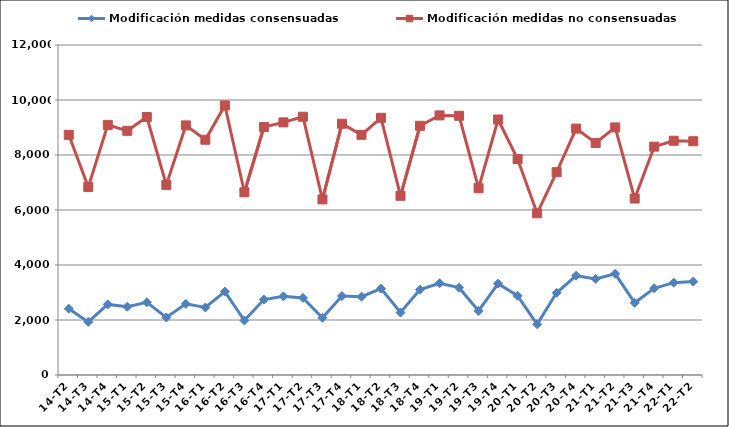
| Category | Modificación medidas consensuadas | Modificación medidas no consensuadas |
|---|---|---|
| 14-T2 | 2411 | 8733 |
| 14-T3 | 1929 | 6834 |
| 14-T4 | 2567 | 9094 |
| 15-T1 | 2483 | 8879 |
| 15-T2 | 2644 | 9382 |
| 15-T3 | 2092 | 6911 |
| 15-T4 | 2586 | 9076 |
| 16-T1 | 2455 | 8554 |
| 16-T2 | 3032 | 9802 |
| 16-T3 | 1983 | 6644 |
| 16-T4 | 2744 | 9017 |
| 17-T1 | 2859 | 9186 |
| 17-T2 | 2804 | 9391 |
| 17-T3 | 2082 | 6385 |
| 17-T4 | 2872 | 9137 |
| 18-T1 | 2846 | 8734 |
| 18-T2 | 3144 | 9353 |
| 18-T3 | 2272 | 6516 |
| 18-T4 | 3104 | 9063 |
| 19-T1 | 3335 | 9440 |
| 19-T2 | 3176 | 9426 |
| 19-T3 | 2332 | 6792 |
| 19-T4 | 3323 | 9291 |
| 20-T1 | 2880 | 7854 |
| 20-T2 | 1846 | 5880 |
| 20-T3 | 2991 | 7376 |
| 20-T4 | 3612 | 8960 |
| 21-T1 | 3496 | 8439 |
| 21-T2 | 3680 | 9003 |
| 21-T3 | 2625 | 6416 |
| 21-T4 | 3154 | 8304 |
| 22-T1 | 3359 | 8518 |
| 22-T2 | 3398 | 8500 |